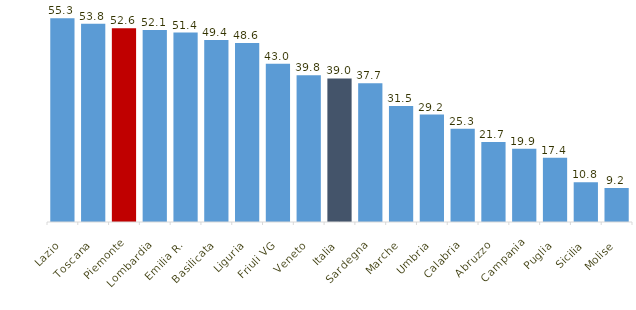
| Category | % |
|---|---|
| Lazio | 55.335 |
| Toscana | 53.833 |
| Piemonte | 52.617 |
| Lombardia | 52.112 |
| Emilia R. | 51.417 |
| Basilicata | 49.386 |
| Liguria | 48.617 |
| Friuli VG | 42.952 |
| Veneto | 39.817 |
| Italia | 38.974 |
| Sardegna | 37.698 |
| Marche | 31.47 |
| Umbria | 29.18 |
| Calabria | 25.34 |
| Abruzzo | 21.726 |
| Campania | 19.906 |
| Puglia | 17.435 |
| Sicilia | 10.82 |
| Molise | 9.235 |